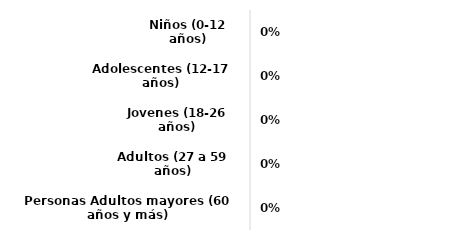
| Category | Series 0 |
|---|---|
| Niños (0-12 años) | 0 |
| Adolescentes (12-17 años) | 0 |
| Jovenes (18-26 años) | 0 |
| Adultos (27 a 59 años) | 0 |
| Personas Adultos mayores (60 años y más) | 0 |